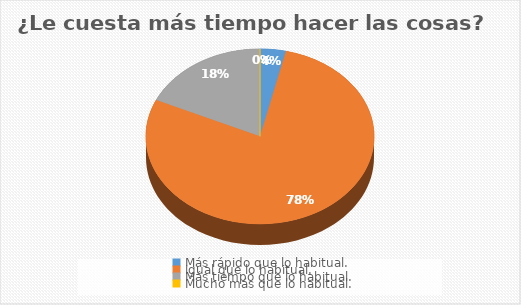
| Category | ¿Le cuesta más tiempo hacer las cosas? |
|---|---|
| Más rápido que lo habitual. | 4 |
| igual que lo habitual. | 86 |
| Más tiempo que lo habitual. | 20 |
| Mucho más que lo habitual. | 0 |